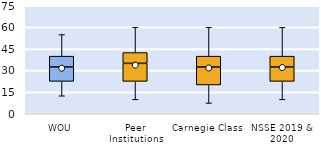
| Category | 25th | 50th | 75th |
|---|---|---|---|
| WOU | 22.5 | 10 | 7.5 |
| Peer Institutions | 22.5 | 12.5 | 7.5 |
| Carnegie Class | 20 | 12.5 | 7.5 |
| NSSE 2019 & 2020 | 22.5 | 10 | 7.5 |